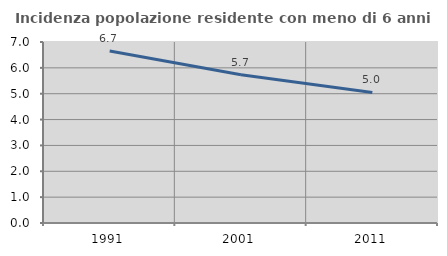
| Category | Incidenza popolazione residente con meno di 6 anni |
|---|---|
| 1991.0 | 6.655 |
| 2001.0 | 5.732 |
| 2011.0 | 5.049 |